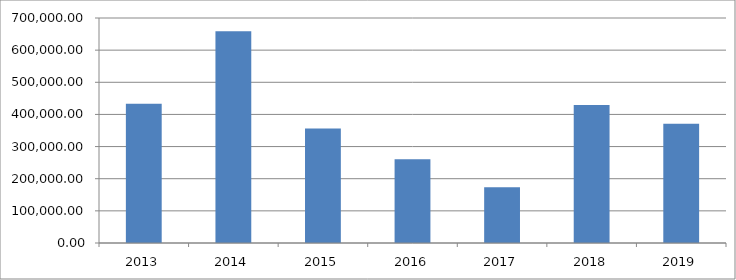
| Category | Series 0 |
|---|---|
| 2013.0 | 433211.104 |
| 2014.0 | 658478.034 |
| 2015.0 | 355853.463 |
| 2016.0 | 260877.623 |
| 2017.0 | 173355.014 |
| 2018.0 | 429524.669 |
| 2019.0 | 371380.947 |